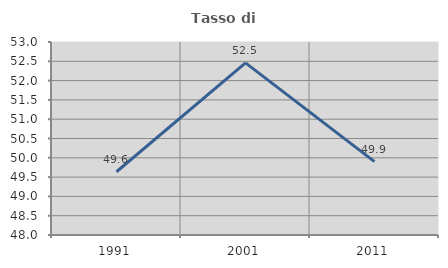
| Category | Tasso di occupazione   |
|---|---|
| 1991.0 | 49.638 |
| 2001.0 | 52.458 |
| 2011.0 | 49.902 |